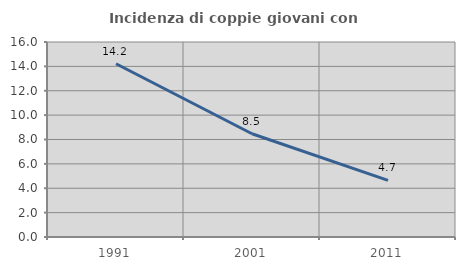
| Category | Incidenza di coppie giovani con figli |
|---|---|
| 1991.0 | 14.216 |
| 2001.0 | 8.475 |
| 2011.0 | 4.651 |